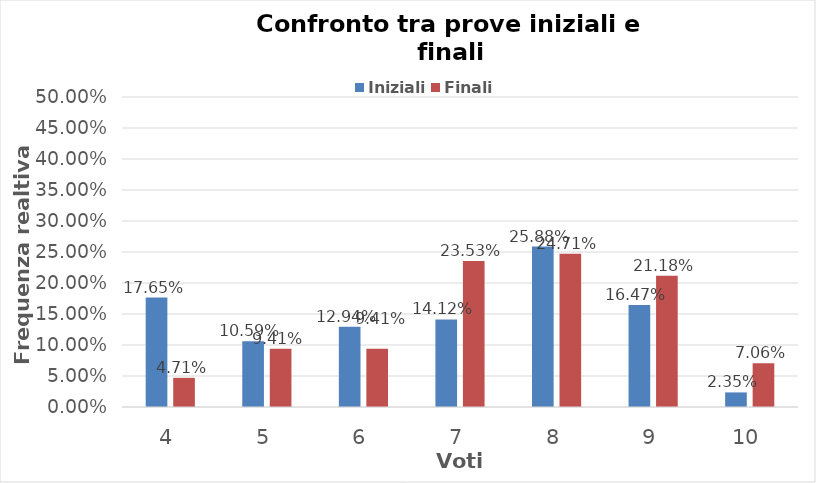
| Category | Iniziali | Finali |
|---|---|---|
| 4.0 | 0.176 | 0.047 |
| 5.0 | 0.106 | 0.094 |
| 6.0 | 0.129 | 0.094 |
| 7.0 | 0.141 | 0.235 |
| 8.0 | 0.259 | 0.247 |
| 9.0 | 0.165 | 0.212 |
| 10.0 | 0.024 | 0.071 |